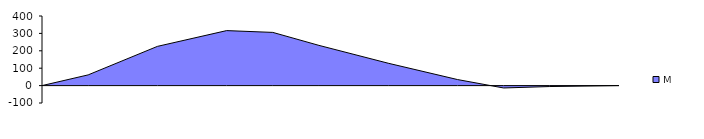
| Category | M |
|---|---|
| 0.0 | 0 |
| 2.5 | 61.633 |
| 5.0 | 225.369 |
| 7.5 | 316.051 |
| 10.0 | 305.778 |
| 12.5 | 231.108 |
| 15.0 | 128.6 |
| 17.5 | 34.814 |
| 20.0 | -13.692 |
| 22.5 | -5.421 |
| 25.0 | 0 |